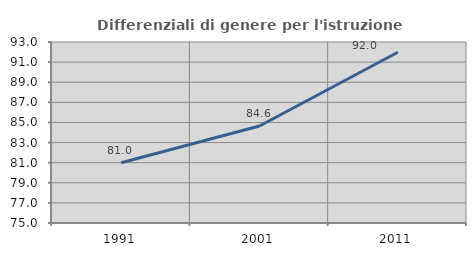
| Category | Differenziali di genere per l'istruzione superiore |
|---|---|
| 1991.0 | 80.993 |
| 2001.0 | 84.643 |
| 2011.0 | 91.977 |